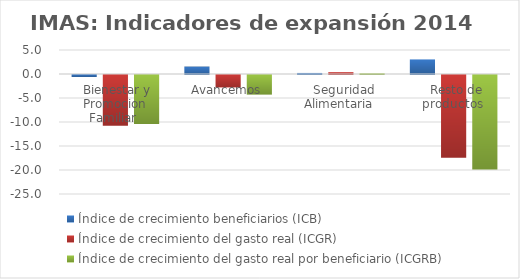
| Category | Índice de crecimiento beneficiarios (ICB)  | Índice de crecimiento del gasto real (ICGR)  | Índice de crecimiento del gasto real por beneficiario (ICGRB)  |
|---|---|---|---|
| Bienestar y Promocion Familiar | -0.413 | -10.566 | -10.195 |
| Avancemos | 1.554 | -2.597 | -4.087 |
| Seguridad Alimentaria | 0.219 | 0.385 | 0.165 |
| Resto de productos | 3.036 | -17.252 | -19.69 |